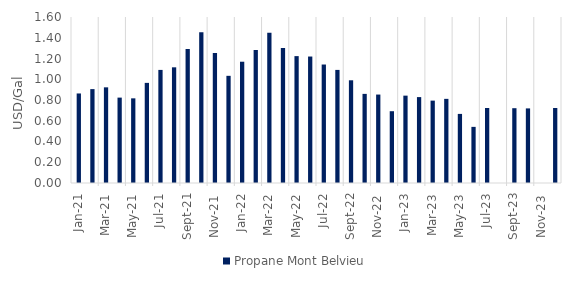
| Category | Propane Mont Belvieu |
|---|---|
| 2021-01-01 | 0.863 |
| 2021-02-01 | 0.905 |
| 2021-03-01 | 0.922 |
| 2021-04-01 | 0.823 |
| 2021-05-01 | 0.816 |
| 2021-06-01 | 0.965 |
| 2021-07-01 | 1.09 |
| 2021-08-01 | 1.115 |
| 2021-09-01 | 1.291 |
| 2021-10-01 | 1.454 |
| 2021-11-01 | 1.252 |
| 2021-12-01 | 1.033 |
| 2022-01-01 | 1.169 |
| 2022-02-01 | 1.283 |
| 2022-03-01 | 1.448 |
| 2022-04-01 | 1.302 |
| 2022-05-01 | 1.223 |
| 2022-06-01 | 1.219 |
| 2022-07-01 | 1.142 |
| 2022-08-01 | 1.09 |
| 2022-09-01 | 0.99 |
| 2022-10-01 | 0.859 |
| 2022-11-01 | 0.852 |
| 2022-12-01 | 0.692 |
| 2023-01-01 | 0.842 |
| 2023-02-01 | 0.828 |
| 2023-03-01 | 0.794 |
| 2023-04-01 | 0.811 |
| 2023-05-01 | 0.666 |
| 2023-06-01 | 0.541 |
| 2023-07-01 | 0.723 |
| 2023-08-01 | 0 |
| 2023-09-01 | 0.721 |
| 2023-10-01 | 0.719 |
| 2023-11-01 | 0 |
| 2023-12-01 | 0.723 |